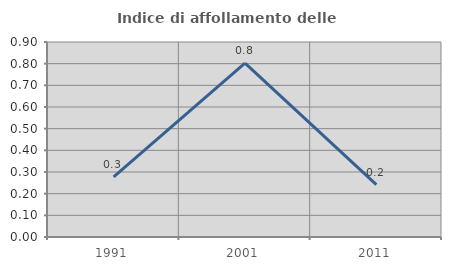
| Category | Indice di affollamento delle abitazioni  |
|---|---|
| 1991.0 | 0.278 |
| 2001.0 | 0.802 |
| 2011.0 | 0.242 |